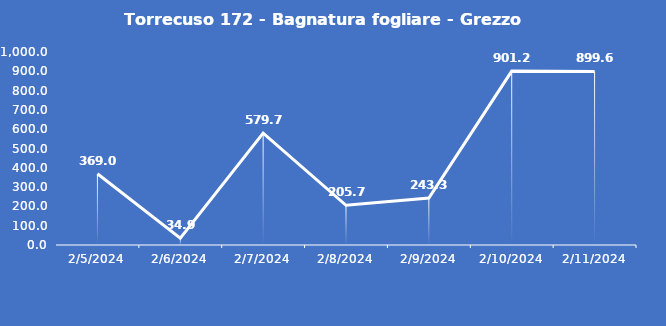
| Category | Torrecuso 172 - Bagnatura fogliare - Grezzo (min) |
|---|---|
| 2/5/24 | 369 |
| 2/6/24 | 34.9 |
| 2/7/24 | 579.7 |
| 2/8/24 | 205.7 |
| 2/9/24 | 243.3 |
| 2/10/24 | 901.2 |
| 2/11/24 | 899.6 |